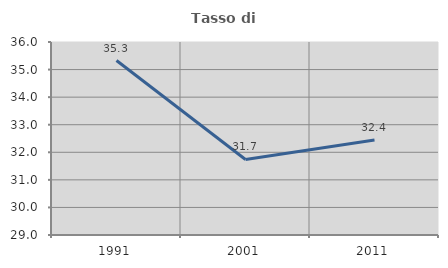
| Category | Tasso di occupazione   |
|---|---|
| 1991.0 | 35.327 |
| 2001.0 | 31.739 |
| 2011.0 | 32.444 |